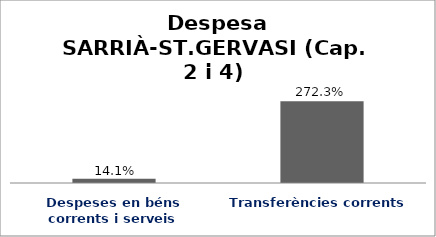
| Category | Series 0 |
|---|---|
| Despeses en béns corrents i serveis | 0.141 |
| Transferències corrents | 2.723 |